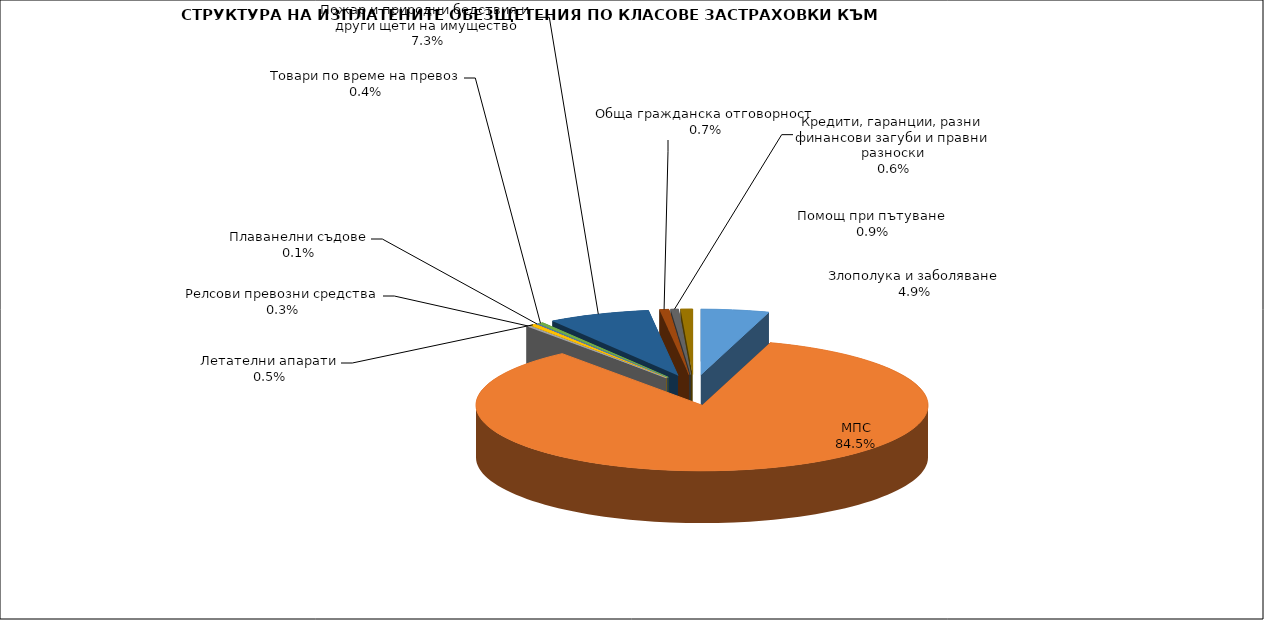
| Category | Series 0 |
|---|---|
| Злополука и заболяване | 0.049 |
| МПС | 0.845 |
| Релсови превозни средства | 0.003 |
| Летателни апарати | 0.005 |
| Плаванелни съдове | 0.001 |
| Товари по време на превоз | 0.004 |
| Пожар и природни бедствия и други щети на имущество | 0.073 |
| Обща гражданска отговорност | 0.007 |
| Кредити, гаранции, разни финансови загуби и правни разноски | 0.006 |
| Помощ при пътуване | 0.009 |